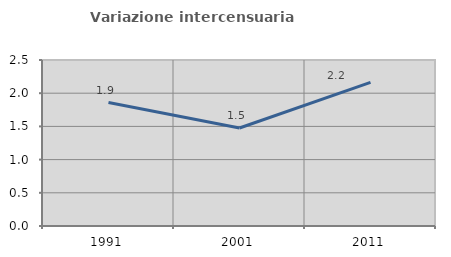
| Category | Variazione intercensuaria annua |
|---|---|
| 1991.0 | 1.859 |
| 2001.0 | 1.476 |
| 2011.0 | 2.163 |